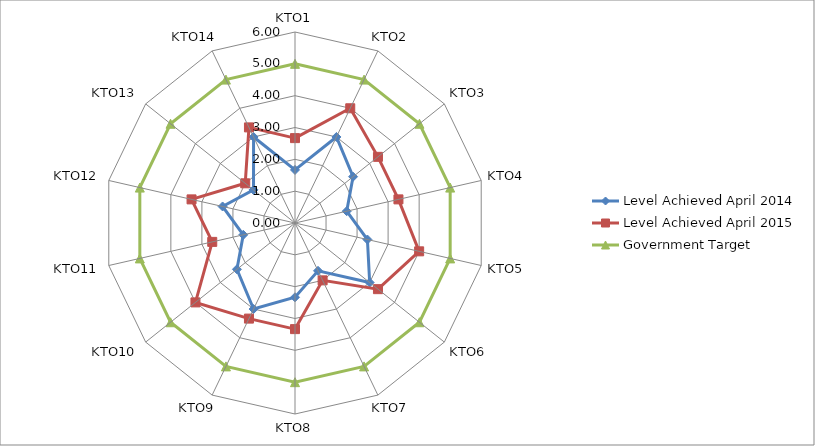
| Category | Level Achieved April 2014 | Level Achieved April 2015 | Government Target |
|---|---|---|---|
| KTO1 | 1.667 | 2.667 | 5 |
| KTO2 | 3 | 4 | 5 |
| KTO3 | 2.333 | 3.333 | 5 |
| KTO4 | 1.667 | 3.333 | 5 |
| KTO5 | 2.333 | 4 | 5 |
| KTO6 | 3 | 3.333 | 5 |
| KTO7 | 1.667 | 2 | 5 |
| KTO8 | 2.333 | 3.333 | 5 |
| KTO9 | 3 | 3.333 | 5 |
| KTO10 | 2.333 | 4 | 5 |
| KTO11 | 1.667 | 2.667 | 5 |
| KTO12 | 2.333 | 3.333 | 5 |
| KTO13 | 1.667 | 2 | 5 |
| KTO14 | 3 | 3.333 | 5 |